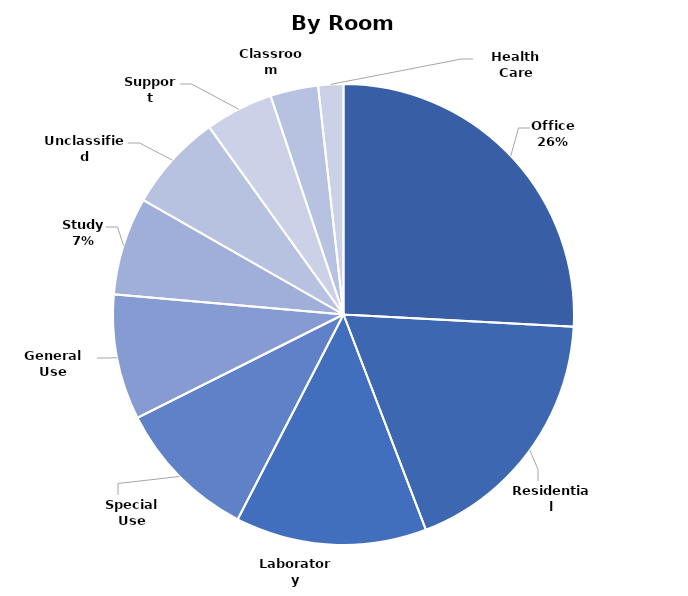
| Category | Total |
|---|---|
| Office | 2670834 |
| Residential | 1894173 |
| Laboratory | 1385097 |
| Special Use | 1034799 |
| General Use | 908454 |
| Study | 709601 |
| Unclassified | 706046 |
| Support | 493734 |
| Classroom | 346882 |
| Health Care | 182295 |